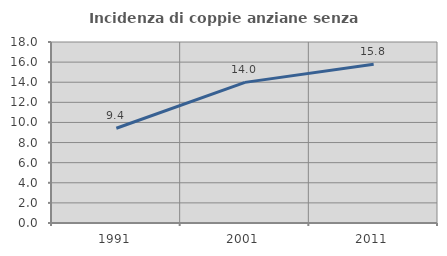
| Category | Incidenza di coppie anziane senza figli  |
|---|---|
| 1991.0 | 9.421 |
| 2001.0 | 13.985 |
| 2011.0 | 15.789 |